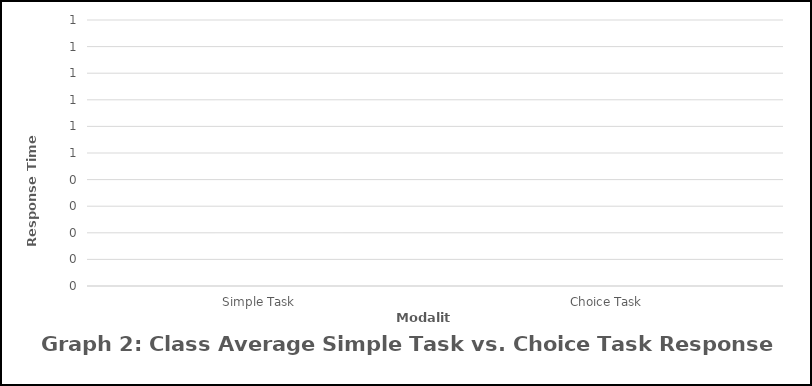
| Category | Series 0 |
|---|---|
| Simple Task | 0 |
| Choice Task | 0 |